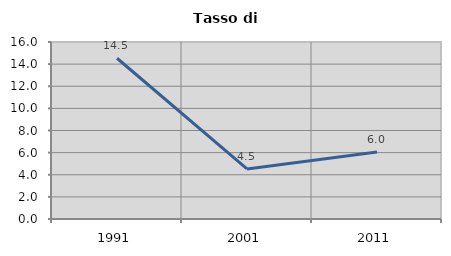
| Category | Tasso di disoccupazione   |
|---|---|
| 1991.0 | 14.531 |
| 2001.0 | 4.527 |
| 2011.0 | 6.049 |